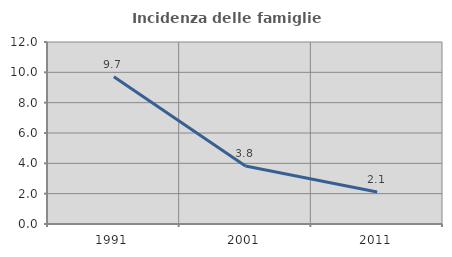
| Category | Incidenza delle famiglie numerose |
|---|---|
| 1991.0 | 9.704 |
| 2001.0 | 3.826 |
| 2011.0 | 2.106 |